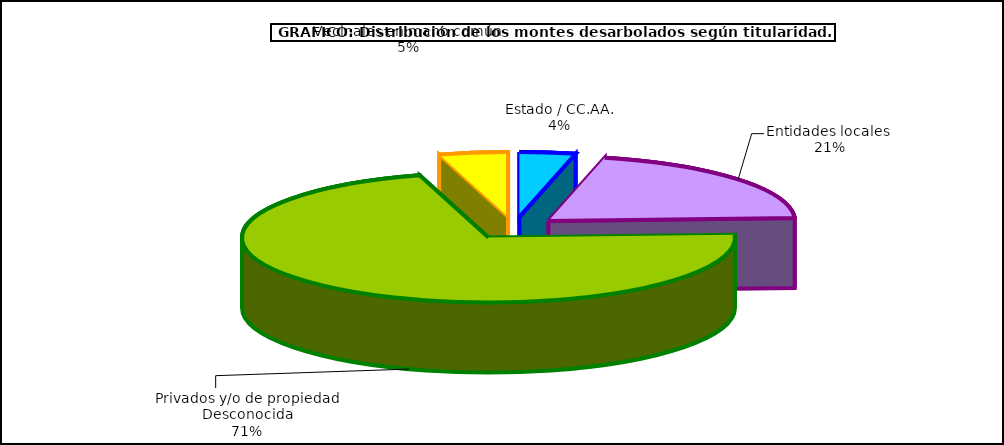
| Category | Series 0 |
|---|---|
| Estado / CC.AA. | 334959.048 |
| Entidades locales  | 1886295.162 |
| Privados y/o de propiedad Desconocida | 6514429.642 |
| Vecinales en mano común  | 412282.758 |